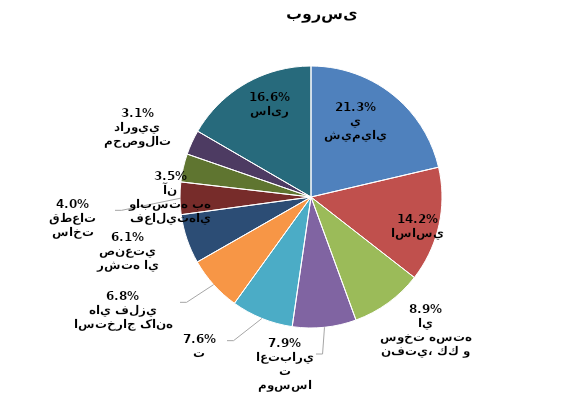
| Category | Series 0 |
|---|---|
| محصولات شيميايي | 0.213 |
| فلزات اساسي | 0.142 |
| فراورده هاي نفتي، كك و سوخت هسته اي | 0.089 |
| بانكها و موسسات اعتباري | 0.079 |
| مخابرات | 0.076 |
| استخراج کانه هاي فلزي | 0.068 |
| شرکتهاي چند رشته اي صنعتي | 0.061 |
| خودرو و ساخت قطعات | 0.04 |
| رايانه و فعاليت‌هاي وابسته به آن | 0.035 |
| مواد و محصولات دارويي | 0.031 |
| سایر | 0.166 |